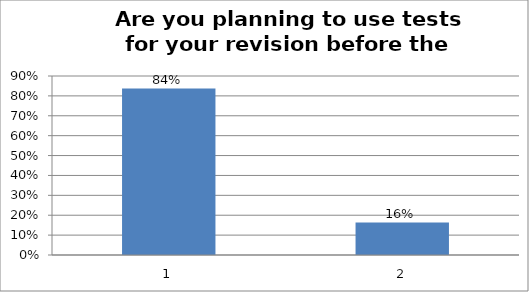
| Category | Series 0 |
|---|---|
| 0 | 0.837 |
| 1 | 0.163 |